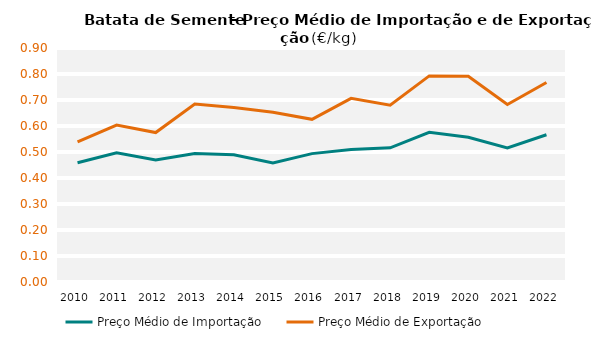
| Category | Preço Médio de Importação | Preço Médio de Exportação |
|---|---|---|
| 2010.0 | 0.459 | 0.539 |
| 2011.0 | 0.497 | 0.604 |
| 2012.0 | 0.469 | 0.575 |
| 2013.0 | 0.494 | 0.685 |
| 2014.0 | 0.489 | 0.671 |
| 2015.0 | 0.457 | 0.653 |
| 2016.0 | 0.494 | 0.626 |
| 2017.0 | 0.51 | 0.706 |
| 2018.0 | 0.516 | 0.68 |
| 2019.0 | 0.576 | 0.793 |
| 2020.0 | 0.557 | 0.792 |
| 2021.0 | 0.516 | 0.683 |
| 2022.0 | 0.566 | 0.767 |